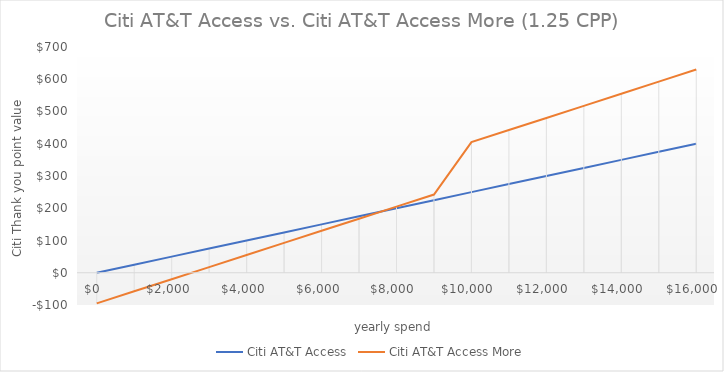
| Category | Citi AT&T Access | Citi AT&T Access More |
|---|---|---|
| 0.0 | 0 | -95 |
| 1000.0 | 25 | -57.5 |
| 2000.0 | 50 | -20 |
| 3000.0 | 75 | 17.5 |
| 4000.0 | 100 | 55 |
| 5000.0 | 125 | 92.5 |
| 6000.0 | 150 | 130 |
| 7000.0 | 175 | 167.5 |
| 8000.0 | 200 | 205 |
| 9000.0 | 225 | 242.5 |
| 10000.0 | 250 | 405 |
| 11000.0 | 275 | 442.5 |
| 12000.0 | 300 | 480 |
| 13000.0 | 325 | 517.5 |
| 14000.0 | 350 | 555 |
| 15000.0 | 375 | 592.5 |
| 16000.0 | 400 | 630 |